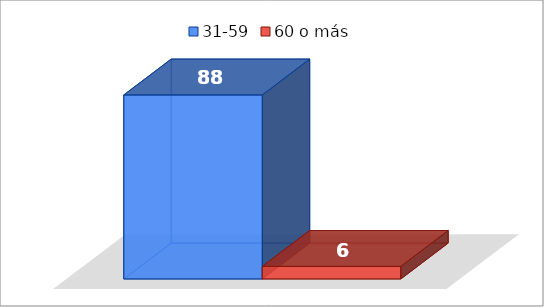
| Category | 31-59 | 60 o más |
|---|---|---|
| 0 | 88 | 6 |